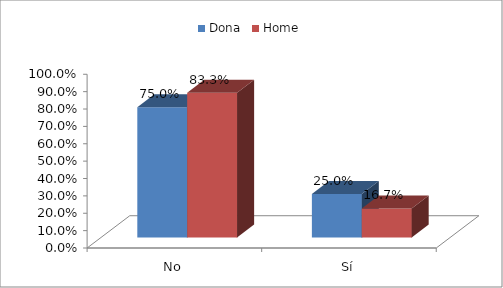
| Category | Dona | Home |
|---|---|---|
| No | 0.75 | 0.833 |
| Sí | 0.25 | 0.167 |